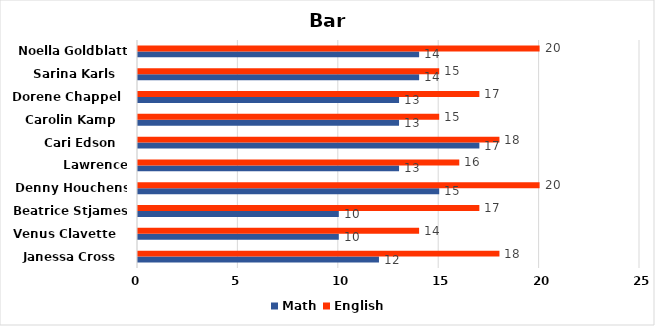
| Category | Math | English |
|---|---|---|
| Janessa Cross   | 12 | 18 |
| Venus Clavette   | 10 | 14 |
| Beatrice Stjames   | 10 | 17 |
| Denny Houchens   | 15 | 20 |
| Lawrence Mickles   | 13 | 16 |
| Cari Edson   | 17 | 18 |
| Carolin Kamp   | 13 | 15 |
| Dorene Chappel   | 13 | 17 |
| Sarina Karls   | 14 | 15 |
| Noella Goldblatt   | 14 | 20 |